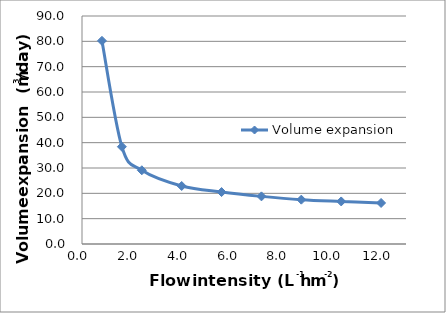
| Category | Volume expansion |
|---|---|
| 0.8 | 80.2 |
| 1.6 | 38.4 |
| 2.4 | 29.1 |
| 4.0 | 22.9 |
| 5.6 | 20.5 |
| 7.2 | 18.8 |
| 8.8 | 17.5 |
| 10.4 | 16.8 |
| 12.0 | 16.2 |